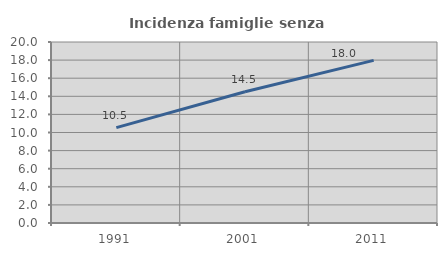
| Category | Incidenza famiglie senza nuclei |
|---|---|
| 1991.0 | 10.542 |
| 2001.0 | 14.497 |
| 2011.0 | 17.971 |